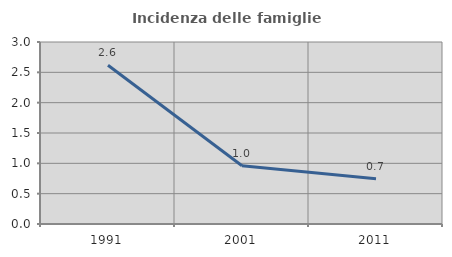
| Category | Incidenza delle famiglie numerose |
|---|---|
| 1991.0 | 2.618 |
| 2001.0 | 0.96 |
| 2011.0 | 0.746 |